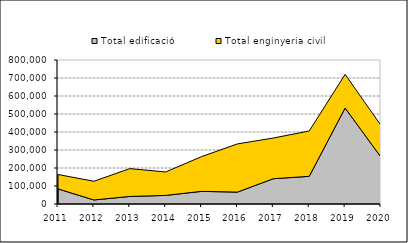
| Category | Total edificació | Total enginyeria civil |
|---|---|---|
| 2011.0 | 83862 | 80090 |
| 2012.0 | 22405 | 103886 |
| 2013.0 | 41900 | 154775 |
| 2014.0 | 47770 | 130206 |
| 2015.0 | 70191 | 193028 |
| 2016.0 | 66132 | 267685 |
| 2017.0 | 140500 | 226050 |
| 2018.0 | 153660 | 251900 |
| 2019.0 | 533210 | 186880 |
| 2020.0 | 260188 | 176419 |